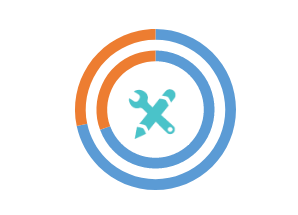
| Category | RS | Series 1 | EU |
|---|---|---|---|
| 0 | 69.4 |  | 71.7 |
| 1 | 30.6 |  | 28.3 |